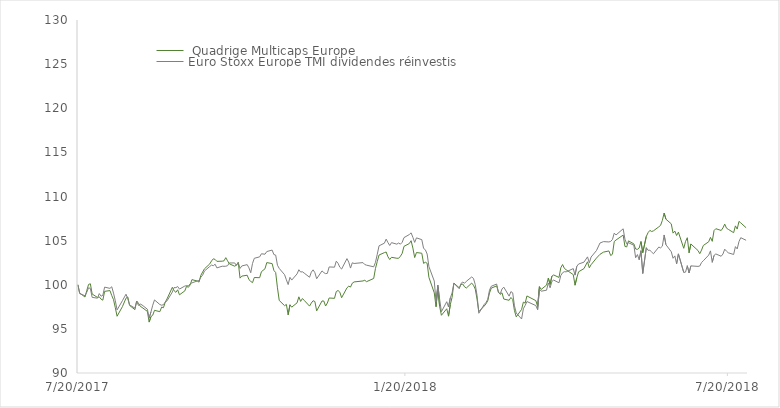
| Category |   Quadrige Multicaps Europe  |  Euro Stoxx Europe TMI dividendes réinvestis  |
|---|---|---|
| 7/20/17 | 100 | 100 |
| 7/21/17 | 99.06 | 98.99 |
| 7/24/17 | 98.61 | 98.76 |
| 7/25/17 | 99.36 | 99.16 |
| 7/26/17 | 100.04 | 99.66 |
| 7/27/17 | 100.11 | 99.58 |
| 7/28/17 | 98.95 | 98.57 |
| 7/31/17 | 98.56 | 98.48 |
| 8/1/17 | 98.63 | 99 |
| 8/2/17 | 98.37 | 98.7 |
| 8/3/17 | 98.25 | 98.8 |
| 8/4/17 | 99.25 | 99.73 |
| 8/7/17 | 99.34 | 99.59 |
| 8/8/17 | 98.78 | 99.77 |
| 8/9/17 | 98.31 | 99.05 |
| 8/10/17 | 97.4 | 98.19 |
| 8/11/17 | 96.43 | 97.15 |
| 8/14/17 | 97.53 | 98.2 |
| 8/16/17 | 98.48 | 98.93 |
| 8/17/17 | 98.62 | 98.41 |
| 8/18/17 | 97.66 | 97.72 |
| 8/21/17 | 97.18 | 97.35 |
| 8/22/17 | 98.16 | 98.13 |
| 8/23/17 | 97.9 | 97.66 |
| 8/24/17 | 97.56 | 97.81 |
| 8/25/17 | 97.43 | 97.71 |
| 8/28/17 | 96.98 | 97.23 |
| 8/29/17 | 95.77 | 96.22 |
| 8/30/17 | 96.39 | 96.91 |
| 8/31/17 | 96.55 | 97.68 |
| 9/1/17 | 97.1 | 98.28 |
| 9/4/17 | 96.95 | 97.76 |
| 9/5/17 | 97.47 | 97.68 |
| 9/6/17 | 97.4 | 97.74 |
| 9/7/17 | 98.02 | 98.03 |
| 9/8/17 | 98.39 | 98.17 |
| 9/11/17 | 99.71 | 99.17 |
| 9/12/17 | 99.32 | 99.69 |
| 9/13/17 | 99.14 | 99.67 |
| 9/14/17 | 99.43 | 99.8 |
| 9/15/17 | 98.86 | 99.51 |
| 9/18/17 | 99.3 | 99.85 |
| 9/19/17 | 99.83 | 99.9 |
| 9/20/17 | 99.71 | 99.87 |
| 9/21/17 | 99.98 | 100.11 |
| 9/22/17 | 100.58 | 100.21 |
| 9/25/17 | 100.42 | 100.43 |
| 9/26/17 | 100.3 | 100.47 |
| 9/27/17 | 101.07 | 100.86 |
| 9/28/17 | 101.44 | 101.09 |
| 9/29/17 | 101.8 | 101.55 |
| 10/2/17 | 102.36 | 102.07 |
| 10/3/17 | 102.7 | 102.23 |
| 10/4/17 | 102.94 | 102.16 |
| 10/5/17 | 102.87 | 102.33 |
| 10/6/17 | 102.65 | 101.91 |
| 10/9/17 | 102.67 | 102.1 |
| 10/10/17 | 102.71 | 102.09 |
| 10/11/17 | 103.07 | 102.1 |
| 10/12/17 | 102.71 | 102.16 |
| 10/13/17 | 102.37 | 102.47 |
| 10/16/17 | 102.1 | 102.47 |
| 10/17/17 | 102.23 | 102.19 |
| 10/18/17 | 102.55 | 102.5 |
| 10/19/17 | 100.75 | 101.85 |
| 10/20/17 | 100.98 | 102.13 |
| 10/23/17 | 101.08 | 102.28 |
| 10/24/17 | 100.58 | 101.91 |
| 10/25/17 | 100.38 | 101.36 |
| 10/26/17 | 100.24 | 102.42 |
| 10/27/17 | 100.82 | 103 |
| 10/30/17 | 100.8 | 103.16 |
| 10/31/17 | 101.48 | 103.51 |
| 11/2/17 | 101.81 | 103.46 |
| 11/3/17 | 102.51 | 103.76 |
| 11/6/17 | 102.4 | 103.93 |
| 11/7/17 | 101.62 | 103.42 |
| 11/8/17 | 101.38 | 103.36 |
| 11/9/17 | 99.65 | 102.21 |
| 11/10/17 | 98.22 | 101.85 |
| 11/13/17 | 97.63 | 101.14 |
| 11/14/17 | 97.77 | 100.56 |
| 11/15/17 | 96.59 | 100.02 |
| 11/16/17 | 97.73 | 100.84 |
| 11/17/17 | 97.46 | 100.53 |
| 11/20/17 | 97.95 | 101.23 |
| 11/21/17 | 98.63 | 101.7 |
| 11/22/17 | 98.11 | 101.44 |
| 11/23/17 | 98.44 | 101.47 |
| 11/24/17 | 98.23 | 101.32 |
| 11/27/17 | 97.58 | 100.85 |
| 11/28/17 | 97.93 | 101.43 |
| 11/29/17 | 98.19 | 101.69 |
| 11/30/17 | 98.1 | 101.37 |
| 12/1/17 | 97.04 | 100.68 |
| 12/4/17 | 98.16 | 101.57 |
| 12/5/17 | 98.16 | 101.38 |
| 12/6/17 | 97.59 | 101.26 |
| 12/7/17 | 97.93 | 101.29 |
| 12/8/17 | 98.5 | 102.02 |
| 12/11/17 | 98.46 | 101.99 |
| 12/12/17 | 99.23 | 102.67 |
| 12/13/17 | 99.35 | 102.43 |
| 12/14/17 | 99.16 | 101.98 |
| 12/15/17 | 98.53 | 101.78 |
| 12/18/17 | 99.65 | 102.96 |
| 12/19/17 | 99.84 | 102.56 |
| 12/20/17 | 99.74 | 101.89 |
| 12/21/17 | 100.18 | 102.49 |
| 12/22/17 | 100.32 | 102.41 |
| 12/27/17 | 100.43 | 102.51 |
| 12/28/17 | 100.51 | 102.29 |
| 12/29/17 | 100.35 | 102.22 |
| 1/2/18 | 100.71 | 102.03 |
| 1/3/18 | 101.85 | 102.54 |
| 1/4/18 | 102.63 | 103.45 |
| 1/5/18 | 103.37 | 104.41 |
| 1/8/18 | 103.64 | 104.71 |
| 1/9/18 | 103.71 | 105.17 |
| 1/10/18 | 103.17 | 104.78 |
| 1/11/18 | 102.86 | 104.45 |
| 1/12/18 | 103.11 | 104.77 |
| 1/15/18 | 103 | 104.6 |
| 1/16/18 | 103 | 104.73 |
| 1/17/18 | 103.23 | 104.6 |
| 1/18/18 | 103.56 | 104.81 |
| 1/19/18 | 104.35 | 105.34 |
| 1/22/18 | 104.67 | 105.69 |
| 1/23/18 | 104.99 | 105.88 |
| 1/24/18 | 104.15 | 105.37 |
| 1/25/18 | 103.08 | 104.8 |
| 1/26/18 | 103.65 | 105.31 |
| 1/29/18 | 103.57 | 105.11 |
| 1/30/18 | 102.42 | 104.12 |
| 1/31/18 | 102.55 | 103.96 |
| 2/1/18 | 102.43 | 103.48 |
| 2/2/18 | 100.83 | 102.05 |
| 2/5/18 | 99.08 | 100.42 |
| 2/6/18 | 97.51 | 98.01 |
| 2/7/18 | 99.7 | 99.96 |
| 2/8/18 | 97.56 | 98.35 |
| 2/9/18 | 96.54 | 96.94 |
| 2/12/18 | 97.28 | 98.08 |
| 2/13/18 | 96.44 | 97.48 |
| 2/14/18 | 97.75 | 98.51 |
| 2/15/18 | 98.58 | 99.07 |
| 2/16/18 | 100.19 | 100.16 |
| 2/19/18 | 99.65 | 99.55 |
| 2/20/18 | 100.03 | 100.15 |
| 2/21/18 | 100.08 | 100.3 |
| 2/22/18 | 99.76 | 100.17 |
| 2/23/18 | 99.63 | 100.39 |
| 2/26/18 | 100.19 | 100.88 |
| 2/27/18 | 99.94 | 100.72 |
| 2/28/18 | 99.51 | 100.02 |
| 3/1/18 | 98.38 | 98.8 |
| 3/2/18 | 96.96 | 96.77 |
| 3/5/18 | 97.58 | 97.76 |
| 3/6/18 | 97.83 | 97.99 |
| 3/7/18 | 98.18 | 98.33 |
| 3/8/18 | 99.07 | 99.39 |
| 3/9/18 | 99.62 | 99.83 |
| 3/12/18 | 99.87 | 100.08 |
| 3/13/18 | 99.18 | 99.12 |
| 3/14/18 | 98.91 | 98.96 |
| 3/15/18 | 99.09 | 99.52 |
| 3/16/18 | 98.38 | 99.73 |
| 3/19/18 | 98.24 | 98.71 |
| 3/20/18 | 98.56 | 99.22 |
| 3/21/18 | 98.34 | 99.09 |
| 3/22/18 | 97.07 | 97.61 |
| 3/23/18 | 96.36 | 96.8 |
| 3/26/18 | 97.2 | 96.12 |
| 3/27/18 | 98.03 | 97.28 |
| 3/28/18 | 97.92 | 97.65 |
| 3/29/18 | 98.73 | 98.1 |
| 4/3/18 | 98.2 | 97.64 |
| 4/4/18 | 97.55 | 97.17 |
| 4/5/18 | 99.79 | 99.51 |
| 4/6/18 | 99.47 | 99.27 |
| 4/9/18 | 99.96 | 99.38 |
| 4/10/18 | 100.76 | 100.21 |
| 4/11/18 | 100.03 | 99.65 |
| 4/12/18 | 100.97 | 100.38 |
| 4/13/18 | 101.11 | 100.53 |
| 4/16/18 | 100.83 | 100.22 |
| 4/17/18 | 101.92 | 101.04 |
| 4/18/18 | 102.29 | 101.36 |
| 4/19/18 | 101.86 | 101.48 |
| 4/20/18 | 101.7 | 101.46 |
| 4/24/18 | 101.15 | 101.83 |
| 4/25/18 | 99.95 | 101.09 |
| 4/26/18 | 100.8 | 102.09 |
| 4/27/18 | 101.47 | 102.35 |
| 4/30/18 | 101.83 | 102.56 |
| 5/2/18 | 102.6 | 103.16 |
| 5/3/18 | 101.92 | 102.49 |
| 5/4/18 | 102.27 | 103.14 |
| 5/7/18 | 103.02 | 103.87 |
| 5/9/18 | 103.45 | 104.73 |
| 5/11/18 | 103.7 | 104.89 |
| 5/14/18 | 103.83 | 104.85 |
| 5/15/18 | 103.31 | 104.91 |
| 5/16/18 | 103.46 | 105.13 |
| 5/17/18 | 104.9 | 105.85 |
| 5/18/18 | 105.07 | 105.64 |
| 5/22/18 | 105.63 | 106.34 |
| 5/23/18 | 104.34 | 105.16 |
| 5/24/18 | 104.29 | 104.63 |
| 5/25/18 | 104.97 | 104.76 |
| 5/28/18 | 104.63 | 104.48 |
| 5/29/18 | 104.05 | 103.06 |
| 5/30/18 | 104.01 | 103.42 |
| 5/31/18 | 104.16 | 102.83 |
| 6/1/18 | 104.9 | 103.86 |
| 6/2/18 | 103.64 | 101.28 |
| 6/4/18 | 105.48 | 104.2 |
| 6/5/18 | 105.91 | 103.9 |
| 6/6/18 | 106.16 | 103.91 |
| 6/7/18 | 106.03 | 103.71 |
| 6/8/18 | 106.11 | 103.51 |
| 6/11/18 | 106.56 | 104.27 |
| 6/12/18 | 106.73 | 104.18 |
| 6/13/18 | 107.29 | 104.37 |
| 6/14/18 | 108.13 | 105.64 |
| 6/15/18 | 107.43 | 104.54 |
| 6/18/18 | 106.9 | 103.74 |
| 6/19/18 | 105.85 | 103 |
| 6/20/18 | 106.08 | 103.27 |
| 6/21/18 | 105.58 | 102.37 |
| 6/22/18 | 105.96 | 103.5 |
| 6/25/18 | 104.13 | 101.4 |
| 6/26/18 | 104.9 | 101.43 |
| 6/27/18 | 105.33 | 102.16 |
| 6/28/18 | 103.62 | 101.33 |
| 6/29/18 | 104.62 | 102.14 |
| 7/3/18 | 103.88 | 102.08 |
| 7/4/18 | 103.52 | 102.12 |
| 7/5/18 | 103.93 | 102.52 |
| 7/6/18 | 104.45 | 102.72 |
| 7/9/18 | 104.87 | 103.36 |
| 7/10/18 | 105.37 | 103.84 |
| 7/11/18 | 104.92 | 102.54 |
| 7/12/18 | 106.14 | 103.32 |
| 7/13/18 | 106.35 | 103.49 |
| 7/16/18 | 106.15 | 103.23 |
| 7/17/18 | 106.44 | 103.48 |
| 7/18/18 | 106.87 | 104.03 |
| 7/19/18 | 106.41 | 103.8 |
| 7/20/18 | 106.28 | 103.62 |
| 7/23/18 | 105.9 | 103.43 |
| 7/24/18 | 106.67 | 104.32 |
| 7/25/18 | 106.31 | 104.06 |
| 7/26/18 | 107.18 | 104.89 |
| 7/27/18 | 107.01 | 105.33 |
| 7/30/18 | 106.46 | 105.04 |